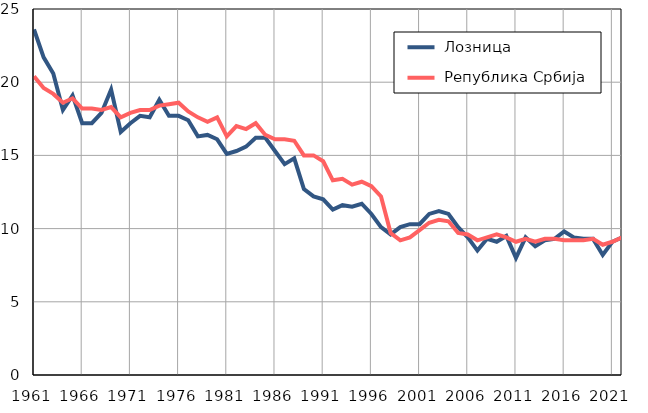
| Category |  Лозница |  Република Србија |
|---|---|---|
| 1961.0 | 23.6 | 20.4 |
| 1962.0 | 21.7 | 19.6 |
| 1963.0 | 20.6 | 19.2 |
| 1964.0 | 18.1 | 18.6 |
| 1965.0 | 19.1 | 18.9 |
| 1966.0 | 17.2 | 18.2 |
| 1967.0 | 17.2 | 18.2 |
| 1968.0 | 17.9 | 18.1 |
| 1969.0 | 19.5 | 18.3 |
| 1970.0 | 16.6 | 17.6 |
| 1971.0 | 17.2 | 17.9 |
| 1972.0 | 17.7 | 18.1 |
| 1973.0 | 17.6 | 18.1 |
| 1974.0 | 18.8 | 18.4 |
| 1975.0 | 17.7 | 18.5 |
| 1976.0 | 17.7 | 18.6 |
| 1977.0 | 17.4 | 18 |
| 1978.0 | 16.3 | 17.6 |
| 1979.0 | 16.4 | 17.3 |
| 1980.0 | 16.1 | 17.6 |
| 1981.0 | 15.1 | 16.3 |
| 1982.0 | 15.3 | 17 |
| 1983.0 | 15.6 | 16.8 |
| 1984.0 | 16.2 | 17.2 |
| 1985.0 | 16.2 | 16.4 |
| 1986.0 | 15.3 | 16.1 |
| 1987.0 | 14.4 | 16.1 |
| 1988.0 | 14.8 | 16 |
| 1989.0 | 12.7 | 15 |
| 1990.0 | 12.2 | 15 |
| 1991.0 | 12 | 14.6 |
| 1992.0 | 11.3 | 13.3 |
| 1993.0 | 11.6 | 13.4 |
| 1994.0 | 11.5 | 13 |
| 1995.0 | 11.7 | 13.2 |
| 1996.0 | 11 | 12.9 |
| 1997.0 | 10.1 | 12.2 |
| 1998.0 | 9.6 | 9.7 |
| 1999.0 | 10.1 | 9.2 |
| 2000.0 | 10.3 | 9.4 |
| 2001.0 | 10.3 | 9.9 |
| 2002.0 | 11 | 10.4 |
| 2003.0 | 11.2 | 10.6 |
| 2004.0 | 11 | 10.5 |
| 2005.0 | 10.1 | 9.7 |
| 2006.0 | 9.4 | 9.6 |
| 2007.0 | 8.5 | 9.2 |
| 2008.0 | 9.3 | 9.4 |
| 2009.0 | 9.1 | 9.6 |
| 2010.0 | 9.5 | 9.4 |
| 2011.0 | 8 | 9.1 |
| 2012.0 | 9.4 | 9.3 |
| 2013.0 | 8.8 | 9.1 |
| 2014.0 | 9.2 | 9.3 |
| 2015.0 | 9.3 | 9.3 |
| 2016.0 | 9.8 | 9.2 |
| 2017.0 | 9.4 | 9.2 |
| 2018.0 | 9.3 | 9.2 |
| 2019.0 | 9.3 | 9.3 |
| 2020.0 | 8.2 | 8.9 |
| 2021.0 | 9.1 | 9.1 |
| 2022.0 | 9.4 | 9.4 |